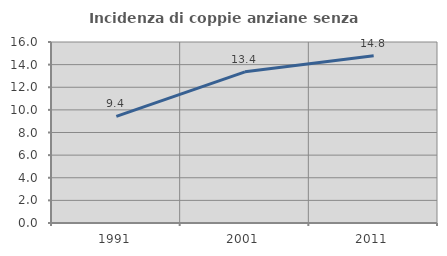
| Category | Incidenza di coppie anziane senza figli  |
|---|---|
| 1991.0 | 9.422 |
| 2001.0 | 13.366 |
| 2011.0 | 14.775 |